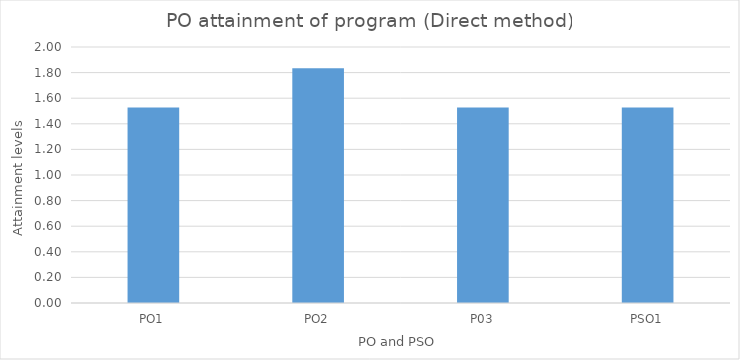
| Category | 1.53 |
|---|---|
| PO1 | 1.528 |
| PO2 | 1.833 |
| P03 | 1.528 |
| PSO1 | 1.528 |